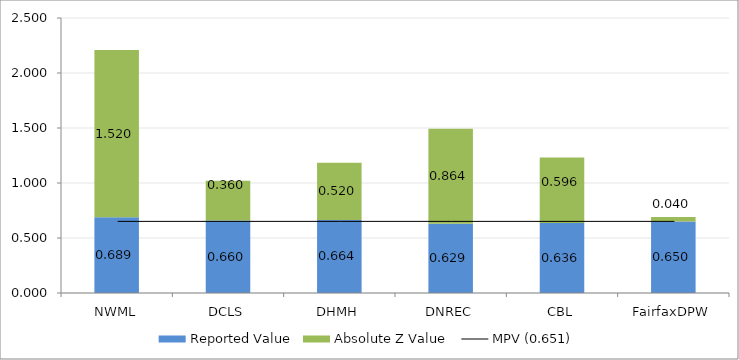
| Category | Reported Value | Absolute Z Value  |
|---|---|---|
| NWML | 0.689 | 1.52 |
| DCLS | 0.66 | 0.36 |
| DHMH | 0.664 | 0.52 |
| DNREC | 0.629 | 0.864 |
| CBL | 0.636 | 0.596 |
| FairfaxDPW | 0.65 | 0.04 |